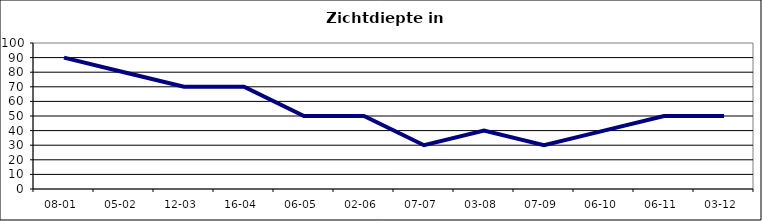
| Category | Zichtdiepte in cm |
|---|---|
| 08-01 | 90 |
| 05-02 | 80 |
| 12-03 | 70 |
| 16-04 | 70 |
| 06-05 | 50 |
| 02-06 | 50 |
| 07-07 | 30 |
| 03-08 | 40 |
| 07-09 | 30 |
| 06-10 | 40 |
| 06-11 | 50 |
| 03-12 | 50 |